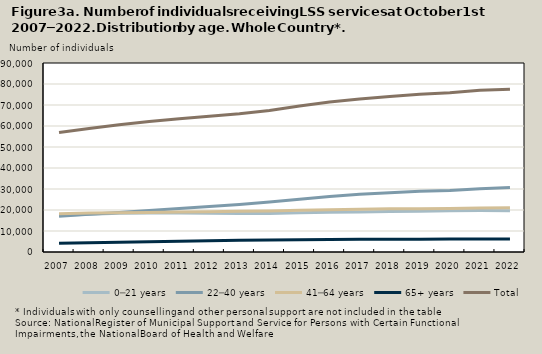
| Category | 0─21 years | 22─40 years | 41─64 years | 65+ years | Total |
|---|---|---|---|---|---|
| 2007.0 | 17529 | 17040 | 18165 | 4127 | 56861 |
| 2008.0 | 17927 | 17939 | 18564 | 4395 | 58825 |
| 2009.0 | 18495 | 18776 | 18698 | 4619 | 60588 |
| 2010.0 | 18612 | 19757 | 18808 | 4919 | 62096 |
| 2011.0 | 18537 | 20697 | 19066 | 5105 | 63405 |
| 2012.0 | 18460 | 21701 | 19185 | 5309 | 64655 |
| 2013.0 | 18296 | 22632 | 19346 | 5570 | 65844 |
| 2014.0 | 18280 | 23819 | 19555 | 5743 | 67397 |
| 2015.0 | 18684 | 25172 | 19889 | 5796 | 69541 |
| 2016.0 | 18913 | 26471 | 20118 | 5930 | 71432 |
| 2017.0 | 19006 | 27505 | 20369 | 6032 | 72912 |
| 2018.0 | 19261 | 28254 | 20548 | 6024 | 74087 |
| 2019.0 | 19433 | 28897 | 20638 | 6119 | 75087 |
| 2020.0 | 19619 | 29319 | 20700 | 6163 | 75801 |
| 2021.0 | 19724 | 30167 | 20924 | 6152 | 76967 |
| 2022.0 | 19597 | 30710 | 21080 | 6159 | 77546 |